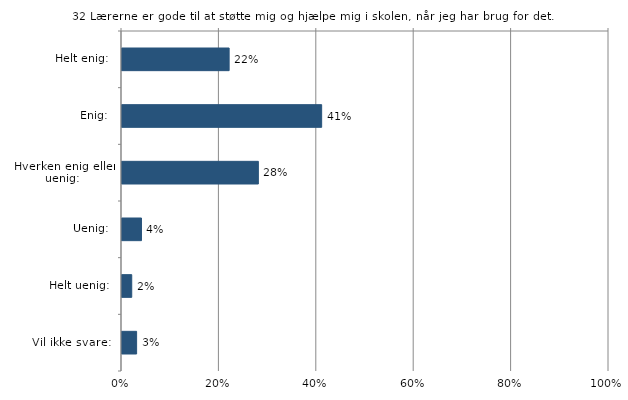
| Category | Lærerne er gode til at støtte mig og hjælpe mig i skolen, når jeg har brug for det. |
|---|---|
| Helt enig:  | 0.22 |
| Enig:  | 0.41 |
| Hverken enig eller uenig:  | 0.28 |
| Uenig:  | 0.04 |
| Helt uenig:  | 0.02 |
| Vil ikke svare:  | 0.03 |